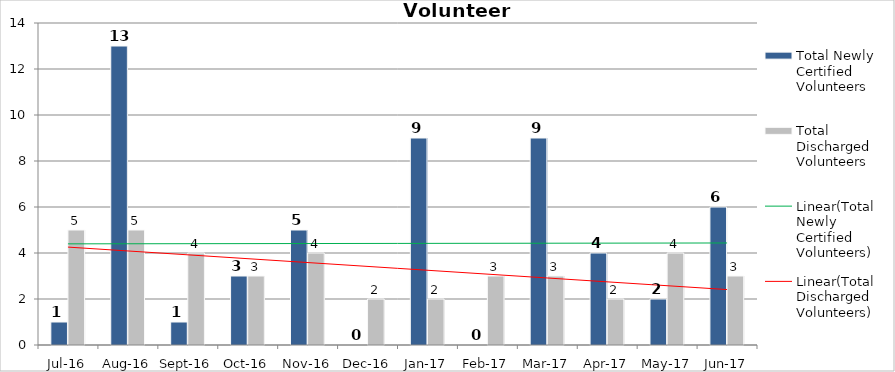
| Category | Total Newly Certified Volunteers | Total Discharged Volunteers |
|---|---|---|
| Jul-16 | 1 | 5 |
| Aug-16 | 13 | 5 |
| Sep-16 | 1 | 4 |
| Oct-16 | 3 | 3 |
| Nov-16 | 5 | 4 |
| Dec-16 | 0 | 2 |
| Jan-17 | 9 | 2 |
| Feb-17 | 0 | 3 |
| Mar-17 | 9 | 3 |
| Apr-17 | 4 | 2 |
| May-17 | 2 | 4 |
| Jun-17 | 6 | 3 |